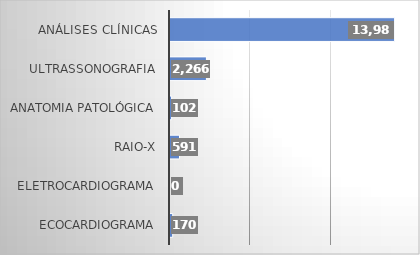
| Category | Series 0 |
|---|---|
| ECOCARDIOGRAMA | 170 |
| ELETROCARDIOGRAMA | 0 |
| RAIO-X | 591 |
| ANATOMIA PATOLÓGICA | 102 |
| ULTRASSONOGRAFIA | 2266 |
| ANÁLISES CLÍNICAS | 13980 |